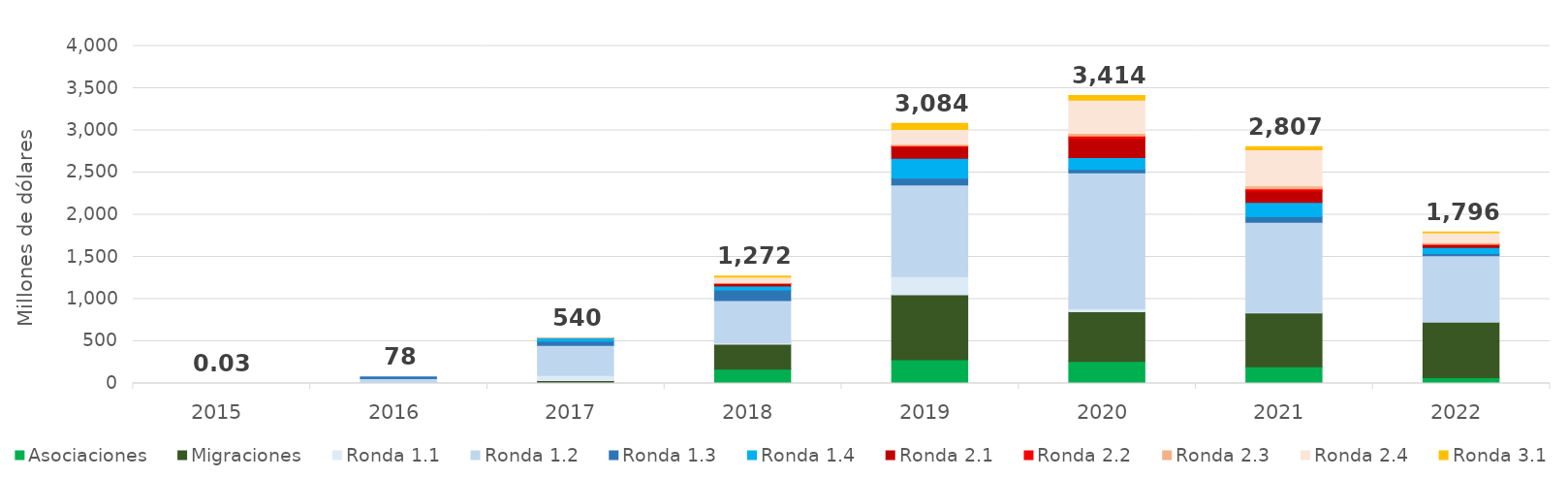
| Category | Asociaciones | Migraciones | Ronda 1.1 | Ronda 1.2 | Ronda 1.3 | Ronda 1.4 | Ronda 2.1 | Ronda 2.2 | Ronda 2.3 | Ronda 2.4 | Ronda 3.1 |
|---|---|---|---|---|---|---|---|---|---|---|---|
| 2015.0 | 0 | 0 | 0.023 | 0.003 | 0 | 0 | 0 | 0 | 0 | 0 | 0 |
| 2016.0 | 0 | 0 | 7.936 | 50.902 | 19.085 | 0 | 0 | 0 | 0 | 0 | 0 |
| 2017.0 | 1.551 | 32.93 | 60.276 | 356.292 | 49.062 | 38.707 | 0.93 | 0 | 0.096 | 0 | 0 |
| 2018.0 | 168.66 | 295.724 | 16.154 | 501.142 | 126.254 | 47.616 | 27.488 | 2.558 | 10.38 | 66.299 | 10.15 |
| 2019.0 | 280.617 | 772.208 | 213.486 | 1086.442 | 82.07 | 235.595 | 134.934 | 12.535 | 18.891 | 175.703 | 71.663 |
| 2020.0 | 260.987 | 590.016 | 33.998 | 1610.735 | 43.009 | 140.295 | 223.002 | 33.095 | 30.995 | 391.695 | 56.039 |
| 2021.0 | 198.847 | 638.47 | 8.662 | 1065.356 | 66.065 | 167.952 | 137.48 | 25.23 | 32.508 | 430.798 | 36.109 |
| 2022.0 | 68.331 | 662.712 | 0.096 | 783.942 | 24.29 | 73.812 | 34.669 | 0.942 | 20.55 | 117.938 | 8.481 |